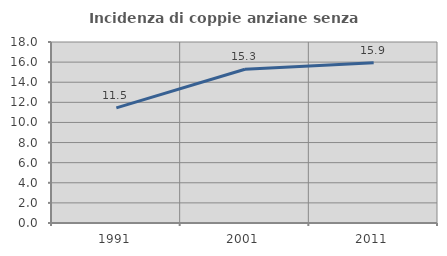
| Category | Incidenza di coppie anziane senza figli  |
|---|---|
| 1991.0 | 11.452 |
| 2001.0 | 15.288 |
| 2011.0 | 15.935 |